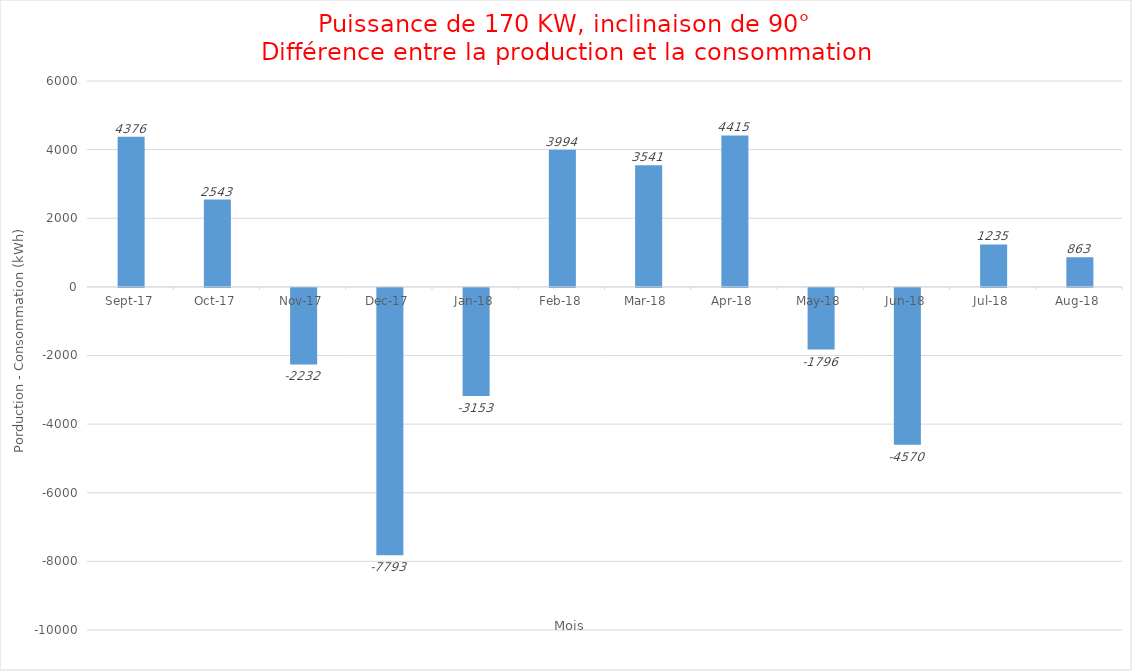
| Category | Series 0 |
|---|---|
| 2017-09-01 | 4376 |
| 2017-10-01 | 2543 |
| 2017-11-01 | -2232 |
| 2017-12-01 | -7793 |
| 2018-01-01 | -3153 |
| 2018-02-01 | 3994 |
| 2018-03-01 | 3541 |
| 2018-04-01 | 4415 |
| 2018-05-01 | -1796 |
| 2018-06-01 | -4570 |
| 2018-07-01 | 1235 |
| 2018-08-01 | 863 |